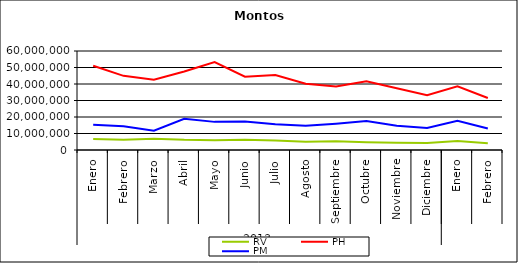
| Category | RV | PH | PM |
|---|---|---|---|
| 0 | 6603412.357 | 51097257.501 | 15291994.497 |
| 1 | 6144371.716 | 44938482.89 | 14418861.164 |
| 2 | 6870539.137 | 42574717.992 | 11735480.075 |
| 3 | 6139858.354 | 47535968.024 | 18924825.739 |
| 4 | 5890476.617 | 53273527.932 | 17047621.863 |
| 5 | 6142686.449 | 44450017.2 | 17254269.094 |
| 6 | 5792277.798 | 45481930.674 | 15546714.502 |
| 7 | 4962192.427 | 40196203.529 | 14644148.591 |
| 8 | 5244267.415 | 38549056.812 | 15946518.356 |
| 9 | 4723321.466 | 41614732.22 | 17536811.707 |
| 10 | 4437368.656 | 37439358.84 | 14761398.421 |
| 11 | 4226608.984 | 33178083.97 | 13384599.022 |
| 12 | 5420667.417 | 38592535.269 | 17738595.757 |
| 13 | 4106438.771 | 31549668.118 | 13082413.394 |